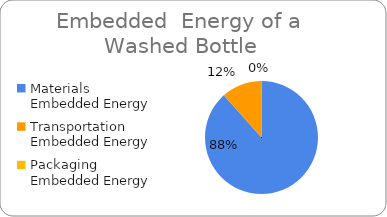
| Category | Series 0 |
|---|---|
| Materials Embedded Energy | 0.019 |
| Transportation Embedded Energy | 0.002 |
| Packaging Embedded Energy | 0 |